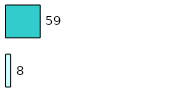
| Category | Series 0 | Series 1 |
|---|---|---|
| 0 | 8 | 59 |